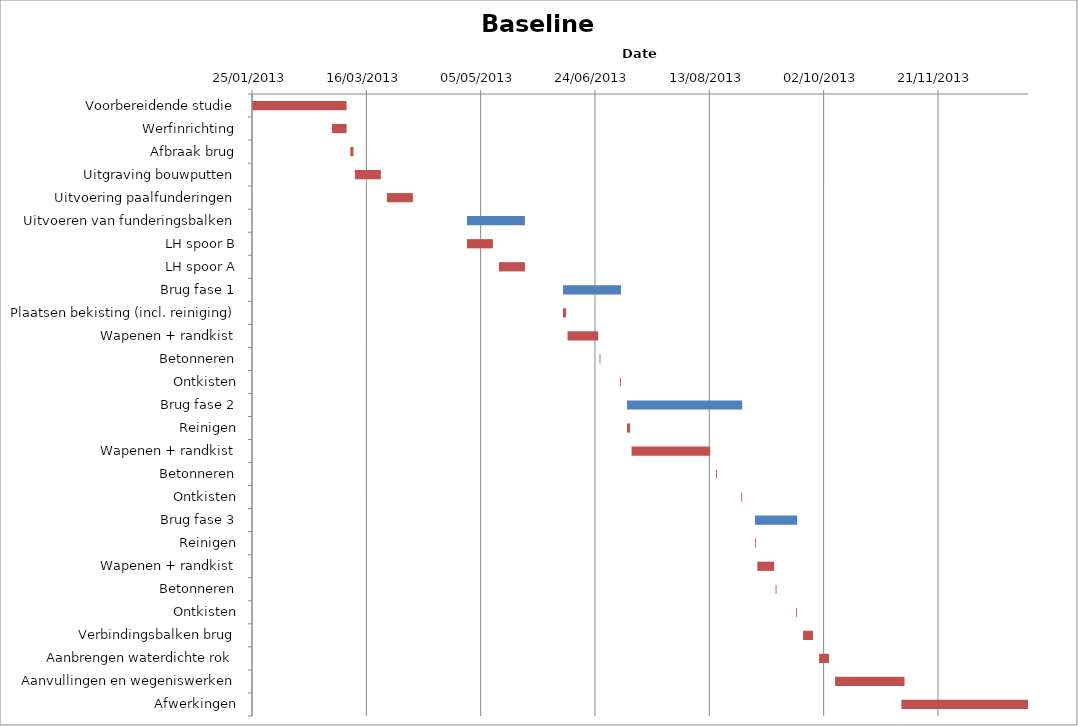
| Category | Baseline start | Actual duration |
|---|---|---|
| Voorbereidende studie | 41299.292 | 41.375 |
| Werfinrichting | 41334.292 | 6.375 |
| Afbraak brug | 41342.292 | 1.375 |
| Uitgraving bouwputten | 41344.292 | 11.375 |
| Uitvoering paalfunderingen | 41358.292 | 11.375 |
| Uitvoeren van funderingsbalken | 41393.292 | 25.375 |
| LH spoor B | 41393.292 | 11.375 |
| LH spoor A | 41407.292 | 11.375 |
| Brug fase 1 | 41435.292 | 25.375 |
| Plaatsen bekisting (incl. reiniging) | 41435.292 | 1.375 |
| Wapenen + randkist | 41437.292 | 13.375 |
| Betonneren | 41451.292 | 0.375 |
| Ontkisten | 41460.292 | 0.375 |
| Brug fase 2 | 41463.292 | 50.375 |
| Reinigen | 41463.292 | 1.375 |
| Wapenen + randkist | 41465.292 | 34.375 |
| Betonneren | 41502.292 | 0.375 |
| Ontkisten | 41513.292 | 0.375 |
| Brug fase 3 | 41519.292 | 18.375 |
| Reinigen | 41519.292 | 0.375 |
| Wapenen + randkist | 41520.292 | 7.375 |
| Betonneren | 41528.292 | 0.375 |
| Ontkisten | 41537.292 | 0.375 |
| Verbindingsbalken brug | 41540.292 | 4.375 |
| Aanbrengen waterdichte rok | 41547.292 | 4.375 |
| Aanvullingen en wegeniswerken | 41554.292 | 30.375 |
| Afwerkingen | 41583.292 | 55.375 |